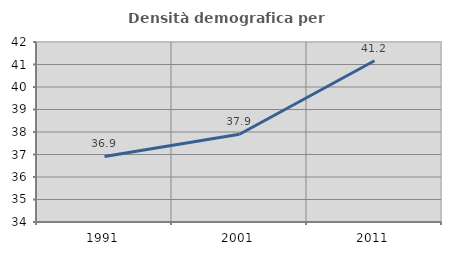
| Category | Densità demografica |
|---|---|
| 1991.0 | 36.911 |
| 2001.0 | 37.902 |
| 2011.0 | 41.166 |